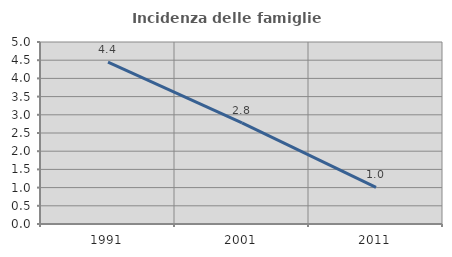
| Category | Incidenza delle famiglie numerose |
|---|---|
| 1991.0 | 4.444 |
| 2001.0 | 2.778 |
| 2011.0 | 1.006 |